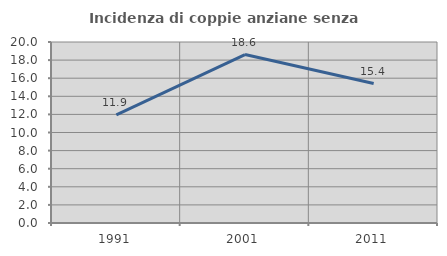
| Category | Incidenza di coppie anziane senza figli  |
|---|---|
| 1991.0 | 11.94 |
| 2001.0 | 18.612 |
| 2011.0 | 15.412 |